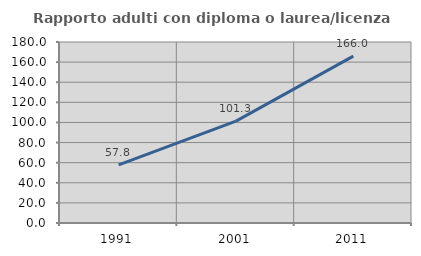
| Category | Rapporto adulti con diploma o laurea/licenza media  |
|---|---|
| 1991.0 | 57.778 |
| 2001.0 | 101.261 |
| 2011.0 | 165.975 |